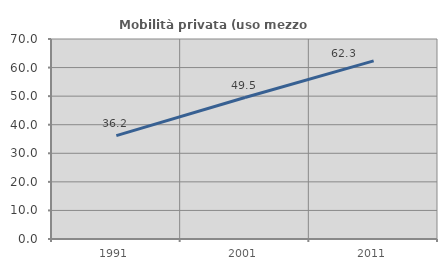
| Category | Mobilità privata (uso mezzo privato) |
|---|---|
| 1991.0 | 36.185 |
| 2001.0 | 49.503 |
| 2011.0 | 62.333 |